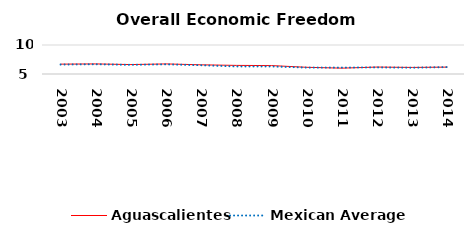
| Category | Aguascalientes | Mexican Average  |
|---|---|---|
| 2003.0 | 6.7 | 6.632 |
| 2004.0 | 6.74 | 6.678 |
| 2005.0 | 6.625 | 6.582 |
| 2006.0 | 6.737 | 6.668 |
| 2007.0 | 6.583 | 6.508 |
| 2008.0 | 6.483 | 6.3 |
| 2009.0 | 6.451 | 6.3 |
| 2010.0 | 6.155 | 6.105 |
| 2011.0 | 6.012 | 6.103 |
| 2012.0 | 6.195 | 6.144 |
| 2013.0 | 6.132 | 6.087 |
| 2014.0 | 6.186 | 6.195 |